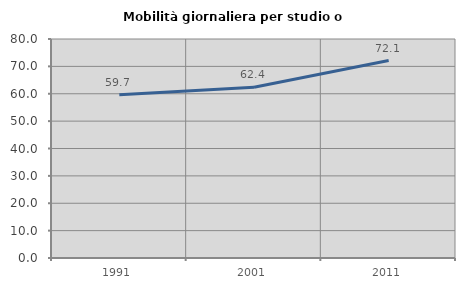
| Category | Mobilità giornaliera per studio o lavoro |
|---|---|
| 1991.0 | 59.676 |
| 2001.0 | 62.405 |
| 2011.0 | 72.136 |